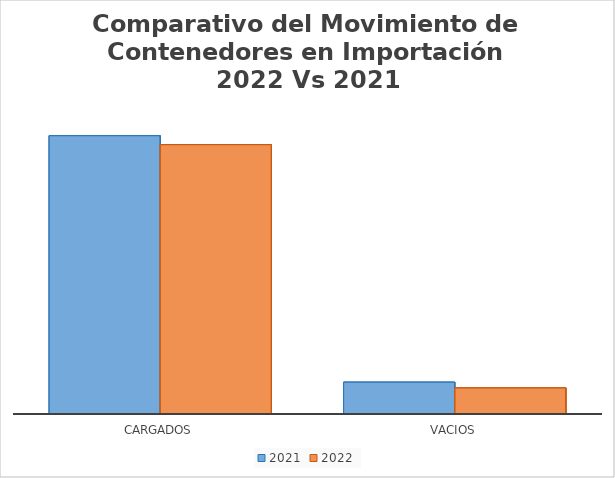
| Category | 2021 | 2022 |
|---|---|---|
| CARGADOS | 162127 | 156905 |
| VACIOS | 18550 | 15212 |